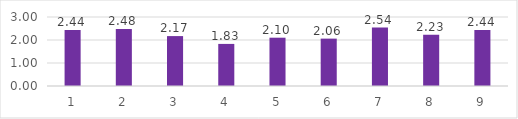
| Category | Series 0 |
|---|---|
| 0 | 2.44 |
| 1 | 2.48 |
| 2 | 2.17 |
| 3 | 1.83 |
| 4 | 2.1 |
| 5 | 2.06 |
| 6 | 2.54 |
| 7 | 2.23 |
| 8 | 2.44 |